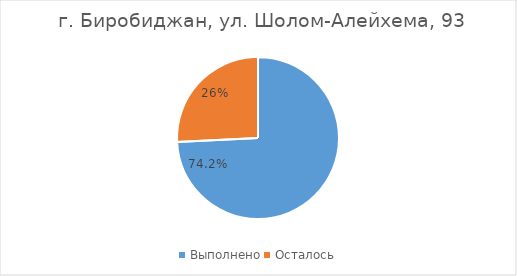
| Category |  г. Биробиджан, ул. Шолом-Алейхема, 93 |
|---|---|
| Выполнено | 0.742 |
| Осталось | 0.258 |